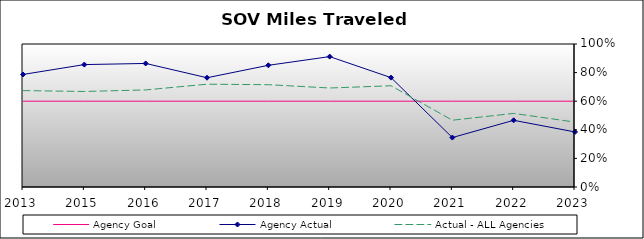
| Category | Agency Goal | Agency Actual | Actual - ALL Agencies |
|---|---|---|---|
| 2013.0 | 0.6 | 0.787 | 0.674 |
| 2015.0 | 0.6 | 0.856 | 0.668 |
| 2016.0 | 0.6 | 0.864 | 0.679 |
| 2017.0 | 0.6 | 0.764 | 0.719 |
| 2018.0 | 0.6 | 0.851 | 0.715 |
| 2019.0 | 0.6 | 0.912 | 0.692 |
| 2020.0 | 0.6 | 0.765 | 0.708 |
| 2021.0 | 0.6 | 0.346 | 0.467 |
| 2022.0 | 0.6 | 0.466 | 0.515 |
| 2023.0 | 0.6 | 0.385 | 0.454 |